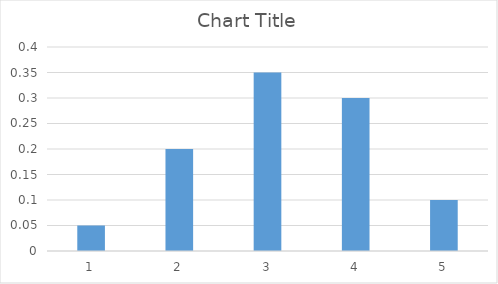
| Category | Series 0 |
|---|---|
| 0 | 0.05 |
| 1 | 0.2 |
| 2 | 0.35 |
| 3 | 0.3 |
| 4 | 0.1 |